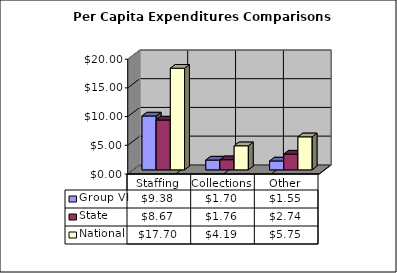
| Category | Group VI | State | National |
|---|---|---|---|
| Staffing | 9.38 | 8.673 | 17.7 |
| Collections | 1.703 | 1.759 | 4.19 |
| Other | 1.546 | 2.74 | 5.75 |